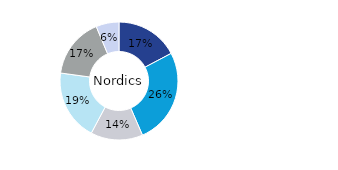
| Category | Nordics |
|---|---|
| Office | 0.173 |
| Residential | 0.262 |
| Retail | 0.143 |
| Logistics* | 0.194 |
| Public Sector | 0.165 |
| Other | 0.063 |